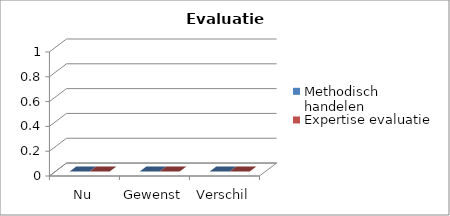
| Category | Methodisch handelen  | Expertise evaluatie |
|---|---|---|
| Nu | 0 | 0 |
| Gewenst | 0 | 0 |
| Verschil | 0 | 0 |